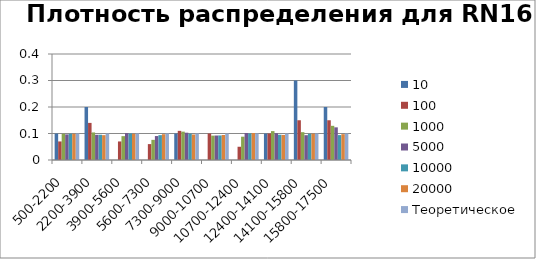
| Category | 10 | 100 | 1000 | 5000 | 10000 | 20000 | Теоретическое |
|---|---|---|---|---|---|---|---|
| 500-2200 | 0.1 | 0.07 | 0.099 | 0.097 | 0.099 | 0.099 | 0.1 |
| 2200-3900 | 0.2 | 0.14 | 0.104 | 0.095 | 0.095 | 0.094 | 0.1 |
| 3900-5600 | 0 | 0.07 | 0.09 | 0.102 | 0.1 | 0.099 | 0.1 |
| 5600-7300 | 0 | 0.06 | 0.076 | 0.09 | 0.094 | 0.097 | 0.1 |
| 7300-9000 | 0.1 | 0.11 | 0.107 | 0.103 | 0.099 | 0.096 | 0.1 |
| 9000-10700 | 0 | 0.1 | 0.092 | 0.092 | 0.093 | 0.094 | 0.1 |
| 10700-12400 | 0 | 0.05 | 0.088 | 0.102 | 0.1 | 0.102 | 0.1 |
| 12400-14100 | 0.1 | 0.1 | 0.109 | 0.101 | 0.095 | 0.095 | 0.1 |
| 14100-15800 | 0.3 | 0.15 | 0.105 | 0.094 | 0.098 | 0.099 | 0.1 |
| 15800-17500 | 0.2 | 0.15 | 0.129 | 0.123 | 0.094 | 0.098 | 0.1 |